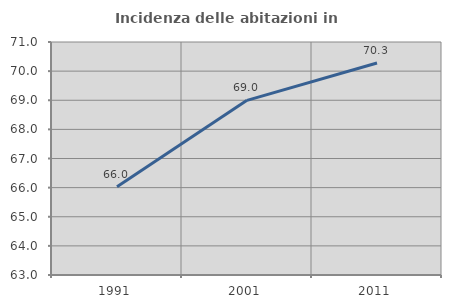
| Category | Incidenza delle abitazioni in proprietà  |
|---|---|
| 1991.0 | 66.033 |
| 2001.0 | 68.997 |
| 2011.0 | 70.281 |